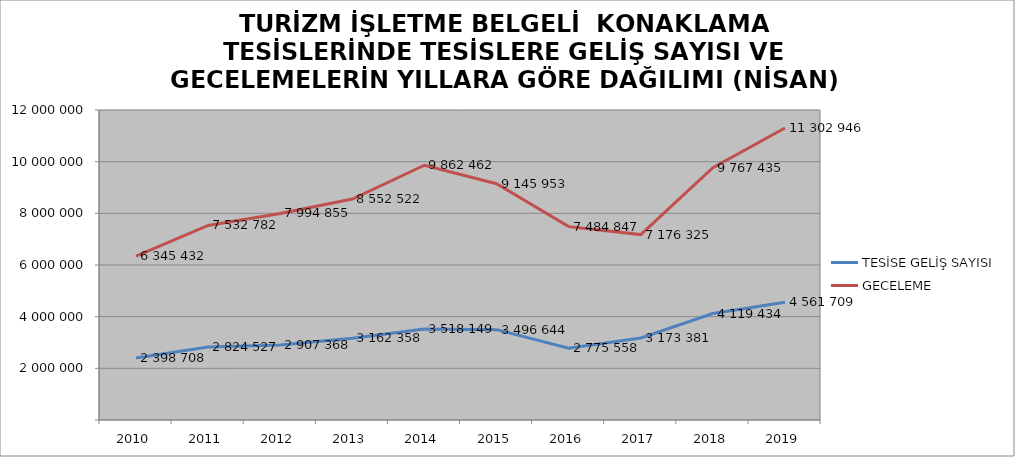
| Category | TESİSE GELİŞ SAYISI | GECELEME |
|---|---|---|
| 2010 | 2398708 | 6345432 |
| 2011 | 2824527 | 7532782 |
| 2012 | 2907368 | 7994855 |
| 2013 | 3162358 | 8552522 |
| 2014 | 3518149 | 9862462 |
| 2015 | 3496644 | 9145953 |
| 2016 | 2775558 | 7484847 |
| 2017 | 3173381 | 7176325 |
| 2018 | 4119434 | 9767435 |
| 2019 | 4561709 | 11302946 |